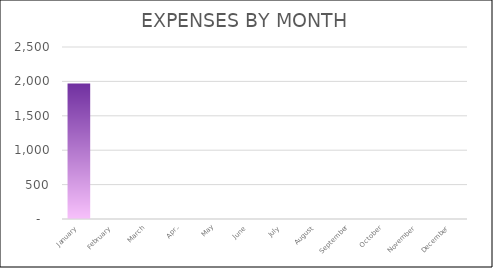
| Category | EXPENSES |
|---|---|
| January | 1970 |
| February | 0 |
| March | 0 |
| April | 0 |
| May | 0 |
| June | 0 |
| July | 0 |
| August | 0 |
| September | 0 |
| October | 0 |
| November | 0 |
| December | 0 |